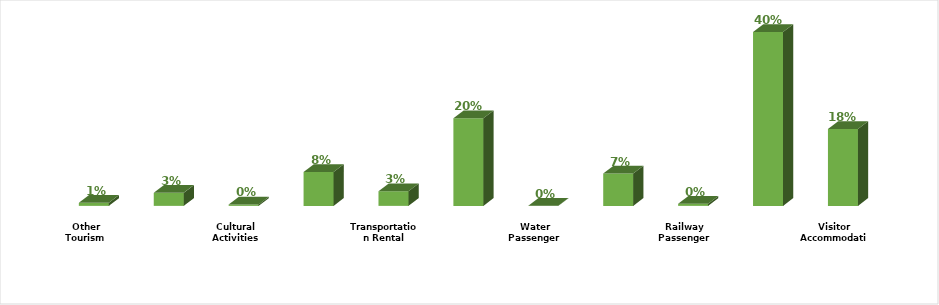
| Category | Series 0 |
|---|---|
| Visitor Accommodation | 0.175 |
| Food and Beverage | 0.396 |
| Railway Passenger Transport | 0.005 |
| Land Passenger Transport | 0.074 |
| Water Passenger Transport | 0.001 |
| Air Passenger Transport | 0.199 |
| Transportation Rental | 0.033 |
| Travel Agencies and Reservation Services  | 0.077 |
| Cultural Activities | 0.003 |
| Sports and Recreational Activities | 0.03 |
| Other Tourism Characteristic Services | 0.007 |